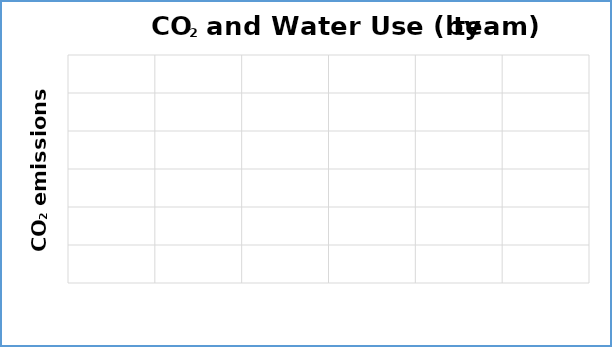
| Category | Water use |
|---|---|
| 0 | 0 |
| 1 | 0 |
| 2 | 0 |
| 3 | 0 |
| 4 | 0 |